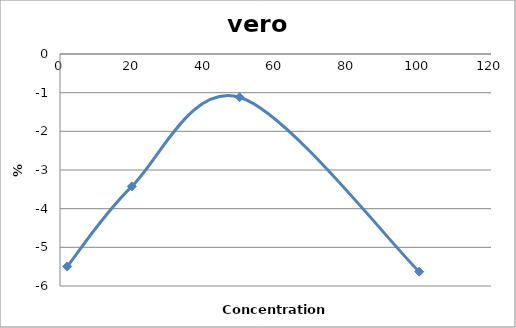
| Category | vero chu2 |
|---|---|
| 100.0 | -5.629 |
| 50.0 | -1.119 |
| 20.0 | -3.424 |
| 2.0 | -5.495 |
| nan | 0 |
| nan | 0 |
| nan | 0 |
| nan | 0 |
| nan | 0 |